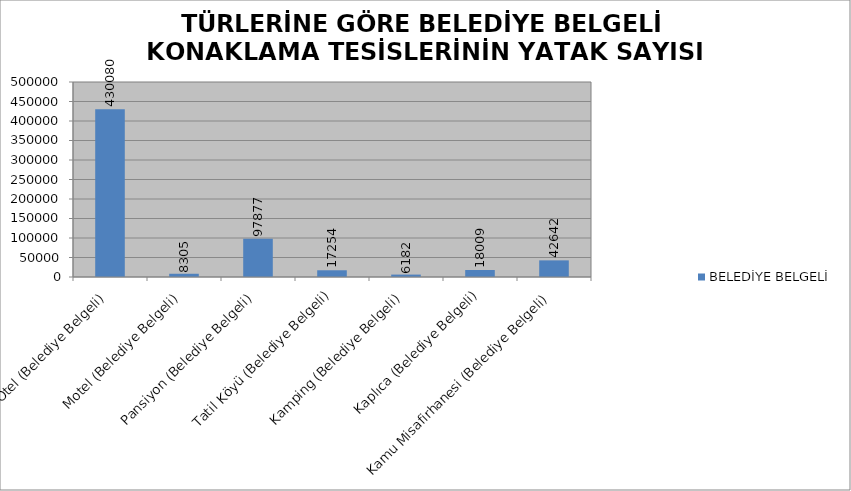
| Category | BELEDİYE BELGELİ |
|---|---|
| Otel (Belediye Belgeli) | 430080 |
| Motel (Belediye Belgeli) | 8305 |
| Pansiyon (Belediye Belgeli) | 97877 |
| Tatil Köyü (Belediye Belgeli) | 17254 |
| Kamping (Belediye Belgeli) | 6182 |
| Kaplıca (Belediye Belgeli) | 18009 |
| Kamu Misafirhanesi (Belediye Belgeli) | 42642 |